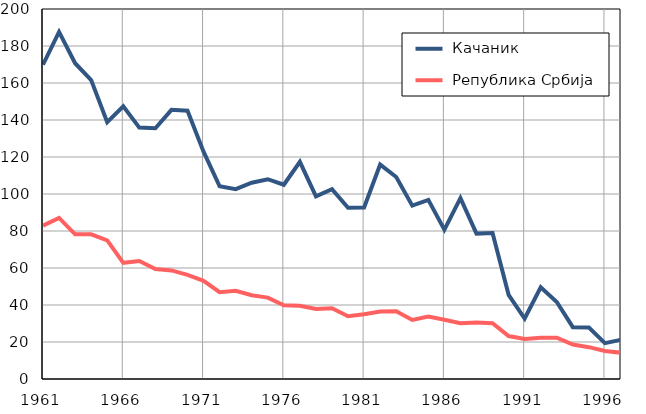
| Category |  Качаник |  Република Србија |
|---|---|---|
| 1961.0 | 169.9 | 82.9 |
| 1962.0 | 187.6 | 87.1 |
| 1963.0 | 170.7 | 78.2 |
| 1964.0 | 161.6 | 78.2 |
| 1965.0 | 138.8 | 74.9 |
| 1966.0 | 147.4 | 62.8 |
| 1967.0 | 135.9 | 63.8 |
| 1968.0 | 135.5 | 59.4 |
| 1969.0 | 145.5 | 58.7 |
| 1970.0 | 145 | 56.3 |
| 1971.0 | 122.9 | 53.1 |
| 1972.0 | 104.2 | 46.9 |
| 1973.0 | 102.6 | 47.7 |
| 1974.0 | 106.1 | 45.3 |
| 1975.0 | 108 | 44 |
| 1976.0 | 105 | 39.9 |
| 1977.0 | 117.4 | 39.6 |
| 1978.0 | 98.7 | 37.8 |
| 1979.0 | 102.6 | 38.2 |
| 1980.0 | 92.6 | 33.9 |
| 1981.0 | 92.7 | 35 |
| 1982.0 | 115.9 | 36.5 |
| 1983.0 | 109.2 | 36.6 |
| 1984.0 | 93.7 | 31.9 |
| 1985.0 | 96.8 | 33.7 |
| 1986.0 | 80.7 | 32 |
| 1987.0 | 97.8 | 30.2 |
| 1988.0 | 78.6 | 30.5 |
| 1989.0 | 78.9 | 30.2 |
| 1990.0 | 45.5 | 23.2 |
| 1991.0 | 32.7 | 21.6 |
| 1992.0 | 49.6 | 22.3 |
| 1993.0 | 41.6 | 22.3 |
| 1994.0 | 28 | 18.6 |
| 1995.0 | 27.8 | 17.2 |
| 1996.0 | 19.4 | 15.1 |
| 1997.0 | 21.2 | 14.2 |